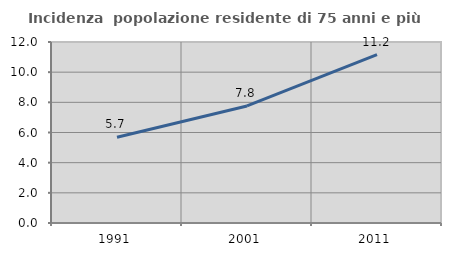
| Category | Incidenza  popolazione residente di 75 anni e più |
|---|---|
| 1991.0 | 5.689 |
| 2001.0 | 7.759 |
| 2011.0 | 11.168 |